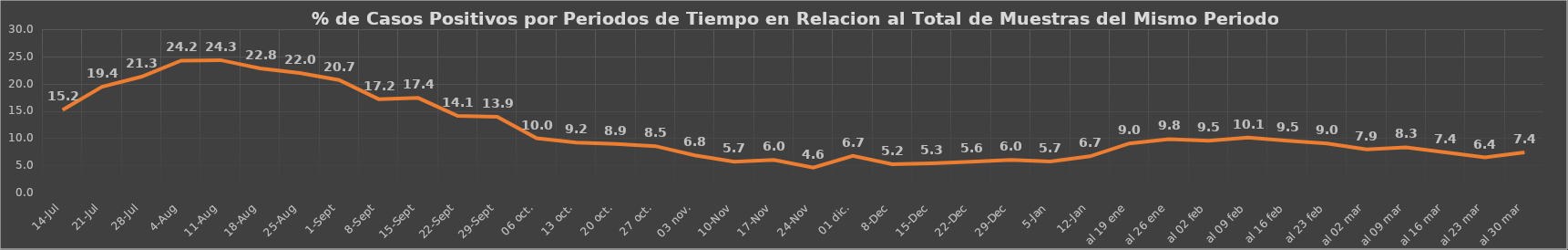
| Category | Series 1 |
|---|---|
| 14-Jul | 15.176 |
| 21-Jul | 19.42 |
| 28-Jul | 21.285 |
| 4-Ago | 24.235 |
| 11-Ago | 24.319 |
| 18-Ago | 22.795 |
| 25-Ago | 21.959 |
| 1-Set | 20.651 |
| 8-Set | 17.154 |
| 15-Set | 17.374 |
| 22-Set | 14.076 |
| 29-Set | 13.895 |
| 06 oct. | 9.966 |
| 13 oct. | 9.195 |
| 20 oct. | 8.915 |
| 27 oct. | 8.521 |
| 03 nov. | 6.828 |
| 10-Nov | 5.654 |
| 17-Nov | 5.983 |
| 24-Nov | 4.579 |
|  01 dic. | 6.72 |
| 8-Dic | 5.183 |
| 15-Dic | 5.348 |
| 22-Dic | 5.649 |
| 29-Dic | 6.002 |
| 5-Ene | 5.693 |
| 12-Ene | 6.656 |
| al 19 ene | 9.025 |
| al 26 ene | 9.811 |
| al 02 feb | 9.494 |
| al 09 feb | 10.077 |
| al 16 feb | 9.503 |
| al 23 feb | 8.995 |
| al 02 mar | 7.918 |
| al 09 mar | 8.305 |
| al 16 mar | 7.379 |
| al 23 mar | 6.443 |
| al 30 mar | 7.383 |